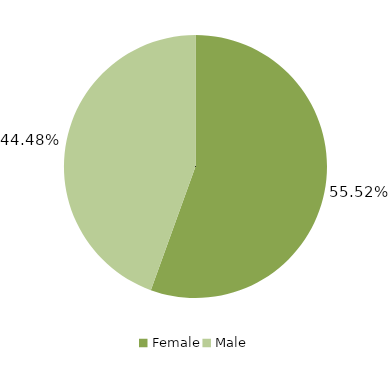
| Category | Total |
|---|---|
| Female | 0.555 |
| Male | 0.445 |